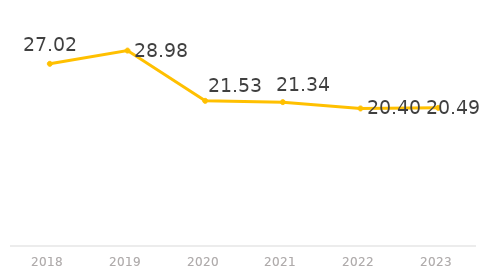
| Category | Series 0 |
|---|---|
| 2018.0 | 27.02 |
| 2019.0 | 28.981 |
| 2020.0 | 21.528 |
| 2021.0 | 21.335 |
| 2022.0 | 20.398 |
| 2023.0 | 20.486 |